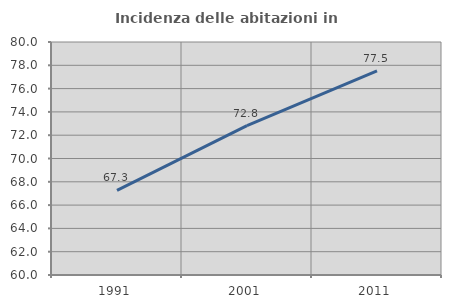
| Category | Incidenza delle abitazioni in proprietà  |
|---|---|
| 1991.0 | 67.266 |
| 2001.0 | 72.814 |
| 2011.0 | 77.514 |